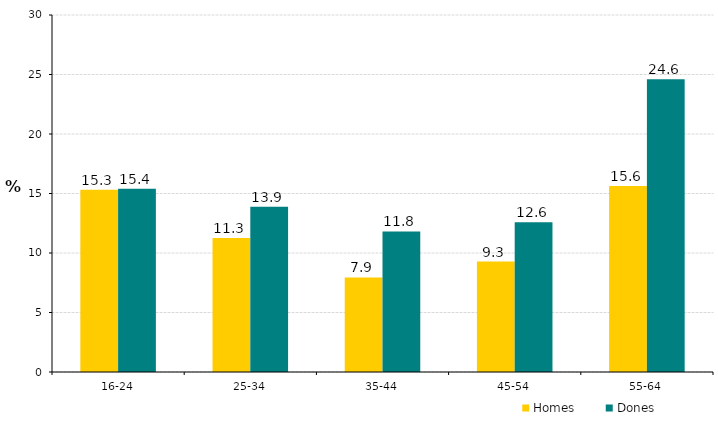
| Category | Homes | Dones |
|---|---|---|
| 16-24 | 15.309 | 15.394 |
| 25-34 | 11.261 | 13.889 |
| 35-44 | 7.949 | 11.81 |
| 45-54 | 9.28 | 12.593 |
| 55-64 | 15.624 | 24.594 |